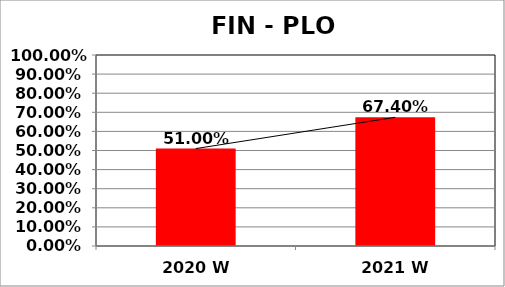
| Category | Series 0 |
|---|---|
| 2020 W | 0.51 |
| 2021 W | 0.674 |